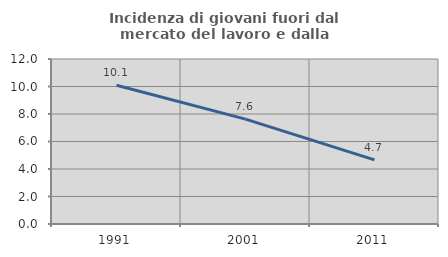
| Category | Incidenza di giovani fuori dal mercato del lavoro e dalla formazione  |
|---|---|
| 1991.0 | 10.095 |
| 2001.0 | 7.626 |
| 2011.0 | 4.659 |